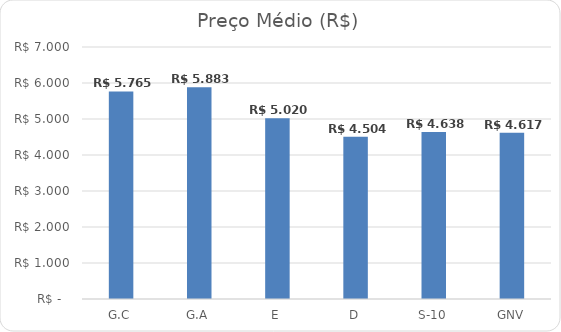
| Category | Series 0 |
|---|---|
| G.C | 5.765 |
| G.A | 5.883 |
| E | 5.02 |
| D | 4.504 |
| S-10 | 4.638 |
| GNV | 4.617 |